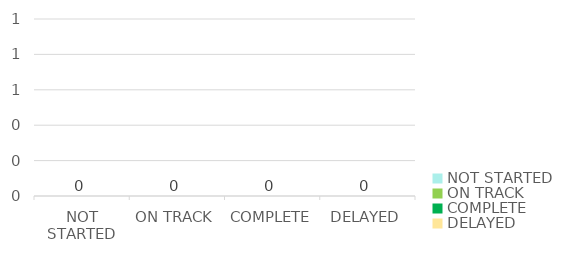
| Category | Series 0 |
|---|---|
| NOT STARTED | 0 |
| ON TRACK | 0 |
| COMPLETE | 0 |
| DELAYED | 0 |